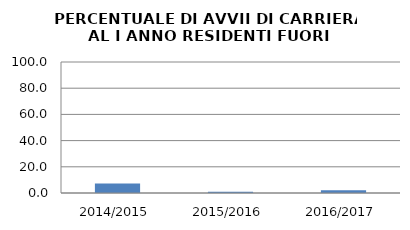
| Category | 2014/2015 2015/2016 2016/2017 |
|---|---|
| 2014/2015 | 7.216 |
| 2015/2016 | 1.01 |
| 2016/2017 | 2.083 |